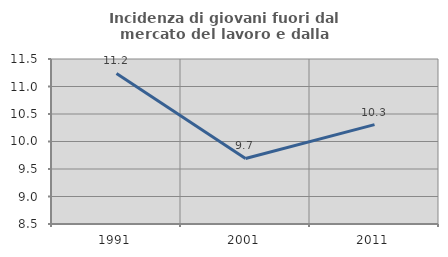
| Category | Incidenza di giovani fuori dal mercato del lavoro e dalla formazione  |
|---|---|
| 1991.0 | 11.239 |
| 2001.0 | 9.692 |
| 2011.0 | 10.306 |